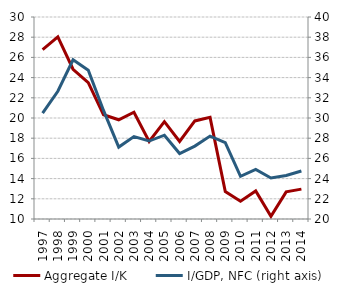
| Category | Aggregate I/K |
|---|---|
| 1997.0 | 26.769 |
| 1998.0 | 28.041 |
| 1999.0 | 24.826 |
| 2000.0 | 23.505 |
| 2001.0 | 20.329 |
| 2002.0 | 19.825 |
| 2003.0 | 20.569 |
| 2004.0 | 17.678 |
| 2005.0 | 19.638 |
| 2006.0 | 17.677 |
| 2007.0 | 19.712 |
| 2008.0 | 20.06 |
| 2009.0 | 12.712 |
| 2010.0 | 11.757 |
| 2011.0 | 12.773 |
| 2012.0 | 10.262 |
| 2013.0 | 12.684 |
| 2014.0 | 12.956 |